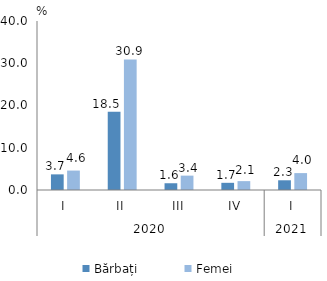
| Category | Bărbați | Femei |
|---|---|---|
| 0 | 3.7 | 4.6 |
| 1 | 18.5 | 30.9 |
| 2 | 1.6 | 3.4 |
| 3 | 1.7 | 2.1 |
| 4 | 2.3 | 4 |